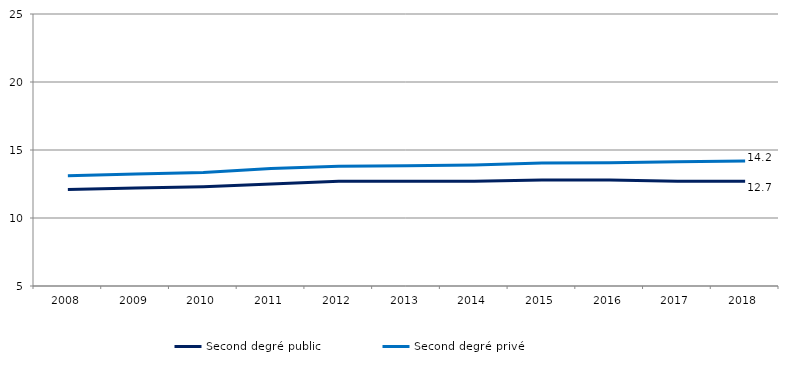
| Category | Second degré public | Second degré privé |
|---|---|---|
| 2008.0 | 12.1 | 13.105 |
| 2009.0 | 12.2 | 13.227 |
| 2010.0 | 12.3 | 13.352 |
| 2011.0 | 12.5 | 13.635 |
| 2012.0 | 12.7 | 13.813 |
| 2013.0 | 12.7 | 13.841 |
| 2014.0 | 12.7 | 13.893 |
| 2015.0 | 12.8 | 14.035 |
| 2016.0 | 12.8 | 14.068 |
| 2017.0 | 12.7 | 14.14 |
| 2018.0 | 12.7 | 14.2 |